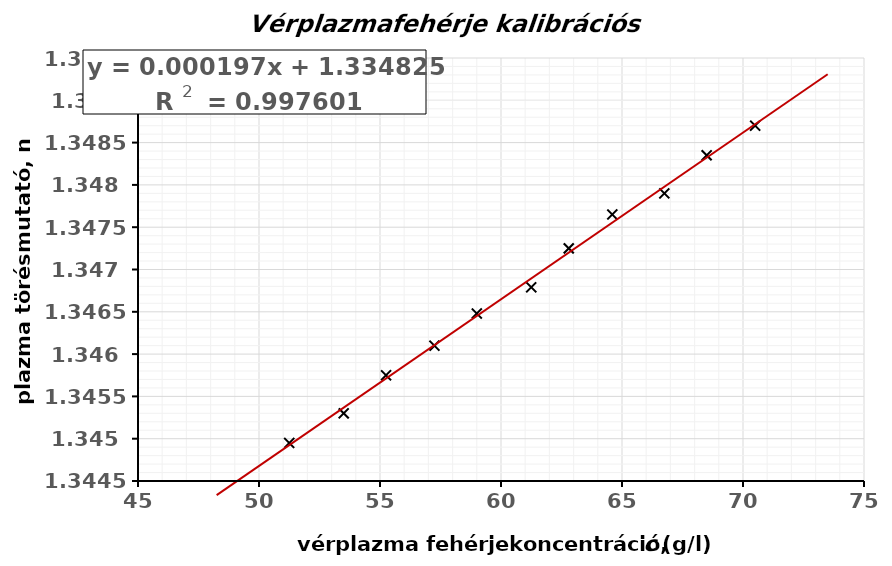
| Category | Series 0 |
|---|---|
| 51.25 | 1.345 |
| 53.5 | 1.345 |
| 55.25 | 1.346 |
| 57.25 | 1.346 |
| 59.0 | 1.346 |
| 61.25 | 1.347 |
| 62.8 | 1.347 |
| 64.6 | 1.348 |
| 66.75 | 1.348 |
| 68.5 | 1.348 |
| 70.5 | 1.349 |